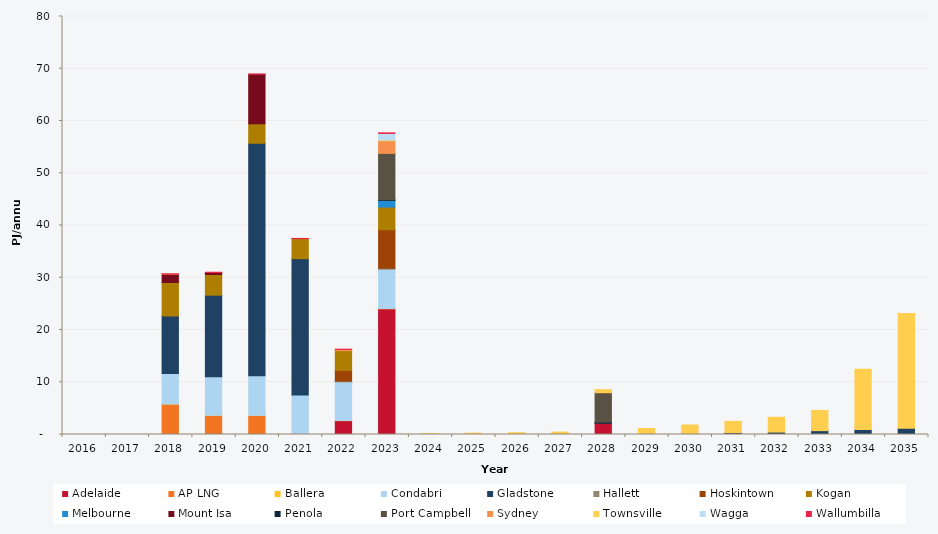
| Category | Adelaide | AP LNG | Ballera | Condabri | Gladstone | Hallett | Hoskintown | Kogan | Melbourne | Mount Isa | Penola | Port Campbell | Sydney | Townsville | Wagga | Wallumbilla |
|---|---|---|---|---|---|---|---|---|---|---|---|---|---|---|---|---|
| 2016.0 | 0 | 0 | 0 | 0 | 0 | 0 | 0 | 0 | 0 | 0 | 0 | 0 | 0 | 0 | 0 | 0 |
| 2017.0 | 0 | 0 | 0 | 0 | 0 | 0 | 0 | 0 | 0 | 0 | 0 | 0 | 0 | 0 | 0 | 0 |
| 2018.0 | 0 | 5.832 | 0.002 | 5.86 | 10.988 | 0 | 0 | 6.411 | 0 | 1.592 | 0 | 0 | 0 | 0.001 | 0 | 0.062 |
| 2019.0 | 0 | 3.637 | 0.032 | 7.374 | 15.619 | 0 | 0 | 3.956 | 0 | 0.39 | 0 | 0 | 0 | 0 | 0 | 0.047 |
| 2020.0 | 0 | 3.637 | 0.023 | 7.561 | 44.513 | 0 | 0 | 3.745 | 0 | 9.468 | 0 | 0 | 0 | 0 | 0 | 0.03 |
| 2021.0 | 0 | 0 | 0.038 | 7.509 | 26.1 | 0 | 0 | 3.837 | 0 | 0 | 0 | 0 | 0 | 0 | 0 | 0.048 |
| 2022.0 | 2.652 | 0 | 0.043 | 7.387 | 0 | 0.145 | 2.031 | 3.793 | 0 | 0 | 0 | 0 | 0.186 | 0.025 | 0 | 0.07 |
| 2023.0 | 24.062 | 0 | 0.055 | 7.521 | 0 | 0.193 | 7.364 | 4.328 | 1.269 | 0 | 0.128 | 8.877 | 2.426 | 0.132 | 1.261 | 0.117 |
| 2024.0 | 0 | 0 | 0 | 0 | 0 | 0 | 0 | 0 | 0 | 0 | 0 | 0 | 0 | 0.171 | 0 | 0 |
| 2025.0 | 0 | 0 | 0 | 0 | 0 | 0 | 0 | 0 | 0 | 0 | 0 | 0 | 0 | 0.257 | 0 | 0 |
| 2026.0 | 0 | 0 | 0 | 0 | 0.003 | 0 | 0 | 0 | 0 | 0 | 0 | 0 | 0 | 0.337 | 0 | 0 |
| 2027.0 | 0 | 0 | 0 | 0 | 0.008 | 0 | 0 | 0 | 0 | 0 | 0 | 0 | 0 | 0.452 | 0 | 0 |
| 2028.0 | 2.173 | 0 | 0 | 0 | 0.013 | 0 | 0 | 0 | 0 | 0 | 0.181 | 5.633 | 0 | 0.59 | 0 | 0 |
| 2029.0 | 0 | 0 | 0 | 0 | 0.052 | 0 | 0 | 0 | 0 | 0 | 0 | 0 | 0 | 1.097 | 0 | 0 |
| 2030.0 | 0 | 0 | 0 | 0 | 0.197 | 0 | 0 | 0 | 0 | 0 | 0 | 0 | 0 | 1.613 | 0 | 0 |
| 2031.0 | 0 | 0 | 0 | 0 | 0.359 | 0 | 0 | 0 | 0 | 0 | 0 | 0 | 0 | 2.157 | 0 | 0 |
| 2032.0 | 0 | 0 | 0 | 0 | 0.462 | 0 | 0 | 0 | 0 | 0 | 0 | 0 | 0 | 2.844 | 0 | 0 |
| 2033.0 | 0 | 0 | 0 | 0 | 0.736 | 0 | 0 | 0 | 0 | 0 | 0 | 0 | 0 | 3.855 | 0 | 0 |
| 2034.0 | 0 | 0 | 0 | 0 | 0.962 | 0 | 0 | 0 | 0 | 0 | 0 | 0 | 0 | 11.534 | 0 | 0 |
| 2035.0 | 0 | 0 | 0 | 0 | 1.181 | 0 | 0 | 0 | 0 | 0 | 0 | 0 | 0 | 21.953 | 0 | 0 |